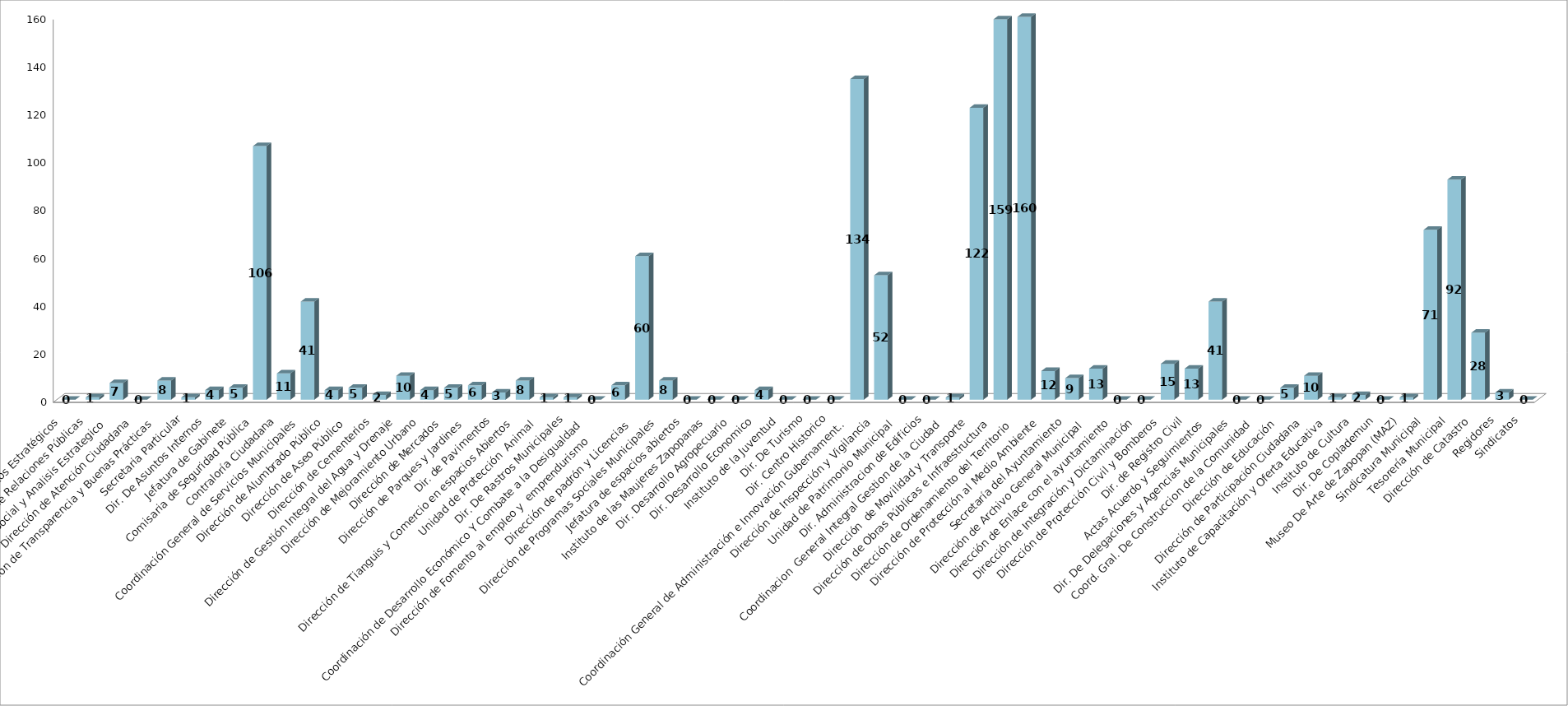
| Category | Series 0 | Series 1 |
|---|---|---|
| Area de Proyectos Estratégicos |  | 0 |
| Área de Relaciones Públicas |  | 1 |
| Comunicación Social y Analisis Estrategico  |  | 7 |
| Dirección de Atención Ciudadana |  | 0 |
| Dirección de Transparencia y Buenas Prácticas |  | 8 |
| Secretaria Particular |  | 1 |
| Dir. De Asuntos Internos |  | 4 |
| Jefatura de Gabinete |  | 5 |
| Comisaria de Seguridad Pública |  | 106 |
| Contraloría Ciudadana |  | 11 |
| Coordinación General de Servicios Municipales |  | 41 |
| Dirección de Alumbrado Público |  | 4 |
| Dirección de Aseo Público  |  | 5 |
| Dirección de Cementerios |  | 2 |
| Dirección de Gestión Integral del Agua y Drenaje |  | 10 |
| Dirección de Mejoramiento Urbano |  | 4 |
| Dirección de Mercados  |  | 5 |
| Dirección de Parques y Jardines  |  | 6 |
| Dir. de Pavimentos |  | 3 |
| Dirección de Tianguis y Comercio en espacios Abiertos |  | 8 |
| Unidad de Protección  Animal  |  | 1 |
| Dir. De Rastros Municipales |  | 1 |
| Coordinación de Desarrollo Económico Y Combate a la Desigualdad |  | 0 |
| Dirección de Fomento al empleo y  emprendurismo         |  | 6 |
| Dirección de padrón y Licencias  |  | 60 |
| Dirección de Programas Sociales Municipales |  | 8 |
| Jefatura de espacios abiertos |  | 0 |
| Instituto de las Maujeres Zapopanas |  | 0 |
|  Dir. Desarrollo Agropecuario |  | 0 |
| Dir. Desarrollo Economico |  | 4 |
| Instituto de la Juventud |  | 0 |
| Dir. De Turismo |  | 0 |
| Dir. Centro Historico |  | 0 |
| Coordinación General de Administración e Innovación Gubernamental |  | 134 |
| Dirección de Inspección y Vigilancia |  | 52 |
| Unidad de Patrimonio Municipal  |  | 0 |
| Dir. Administracion de Edificios |  | 0 |
| Coordinacion  General Integral Gestion de la Ciudad |  | 1 |
| Dirección  de Movilidad y Transporte |  | 122 |
| Dirección de Obras Públicas e Infraestructura |  | 159 |
| Dirección de Ordenamiento del Territorio  |  | 160 |
| Dirección de Protección al Medio Ambiente  |  | 12 |
| Secretaría del Ayuntamiento |  | 9 |
| Dirección de Archivo General Municipal  |  | 13 |
| Dirección de Enlace con el ayuntamiento |  | 0 |
| Dirección de Integración y Dictaminación |  | 0 |
| Dirección de Protección Civil y Bomberos |  | 15 |
| Dir. de Registro Civil |  | 13 |
| Actas Acuerdo y Seguimientos  |  | 41 |
| Dir. De Delegaciones y Agencias Municipales |  | 0 |
| Coord. Gral. De Construccion de la Comunidad |  | 0 |
| Dirección de Educación  |  | 5 |
| Dirección de Participación Ciudadana |  | 10 |
| Instituto de Capacitación y Oferta Educativa |  | 1 |
| Instituto de Cultura  |  | 2 |
| Dir. De Coplademun |  | 0 |
| Museo De Arte de Zapopan (MAZ) |  | 1 |
| Sindicatura Municipal |  | 71 |
| Tesorería Municipal |  | 92 |
| Dirección de Catastro |  | 28 |
| Regidores |  | 3 |
| Sindicatos |  | 0 |